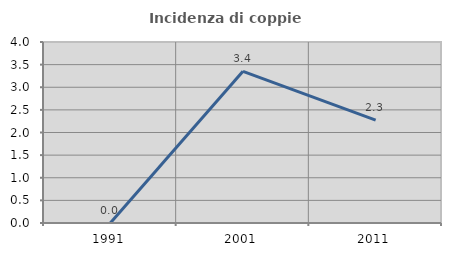
| Category | Incidenza di coppie miste |
|---|---|
| 1991.0 | 0 |
| 2001.0 | 3.352 |
| 2011.0 | 2.273 |